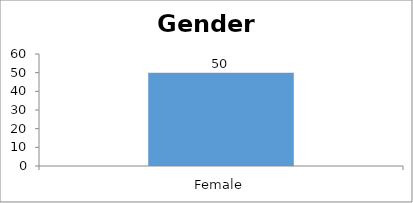
| Category | Gender |
|---|---|
| Female | 50 |